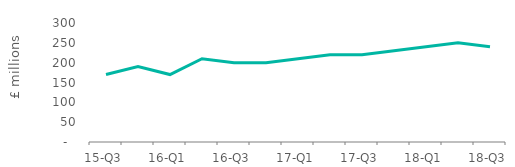
| Category | Full market |
|---|---|
| 15-Q3 | 170 |
| 15-Q4 | 190 |
| 16-Q1 | 170 |
| 16-Q2 | 210 |
| 16-Q3 | 200 |
| 16-Q4 | 200 |
| 17-Q1 | 210 |
| 17-Q2 | 220 |
| 17-Q3 | 220 |
| 17-Q4 | 230 |
| 18-Q1 | 240 |
| 18-Q2 | 250 |
| 18-Q3 | 240 |